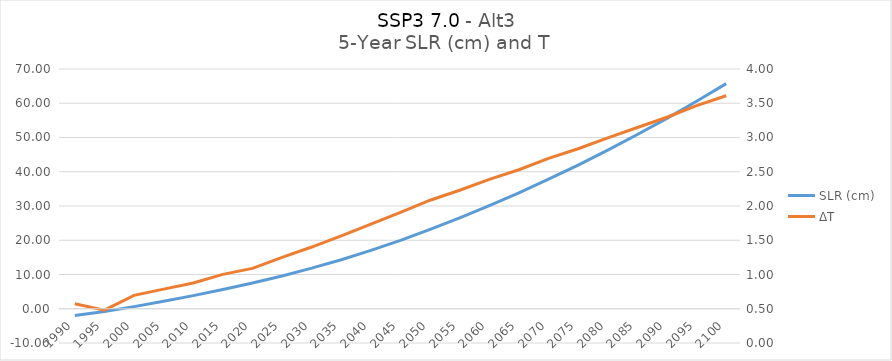
| Category | SLR (cm) |
|---|---|
| 1990.0 | -1.941 |
| 1995.0 | -0.818 |
| 2000.0 | 0.621 |
| 2005.0 | 2.18 |
| 2010.0 | 3.834 |
| 2015.0 | 5.633 |
| 2020.0 | 7.505 |
| 2025.0 | 9.582 |
| 2030.0 | 11.846 |
| 2035.0 | 14.321 |
| 2040.0 | 17.03 |
| 2045.0 | 19.967 |
| 2050.0 | 23.152 |
| 2055.0 | 26.519 |
| 2060.0 | 30.098 |
| 2065.0 | 33.847 |
| 2070.0 | 37.817 |
| 2075.0 | 41.962 |
| 2080.0 | 46.316 |
| 2085.0 | 50.864 |
| 2090.0 | 55.602 |
| 2095.0 | 60.571 |
| 2100.0 | 65.721 |